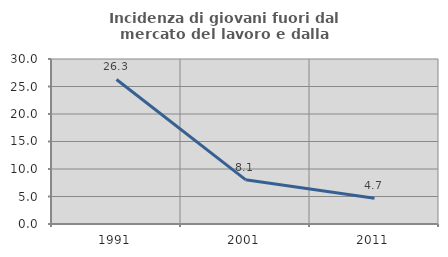
| Category | Incidenza di giovani fuori dal mercato del lavoro e dalla formazione  |
|---|---|
| 1991.0 | 26.275 |
| 2001.0 | 8.065 |
| 2011.0 | 4.673 |